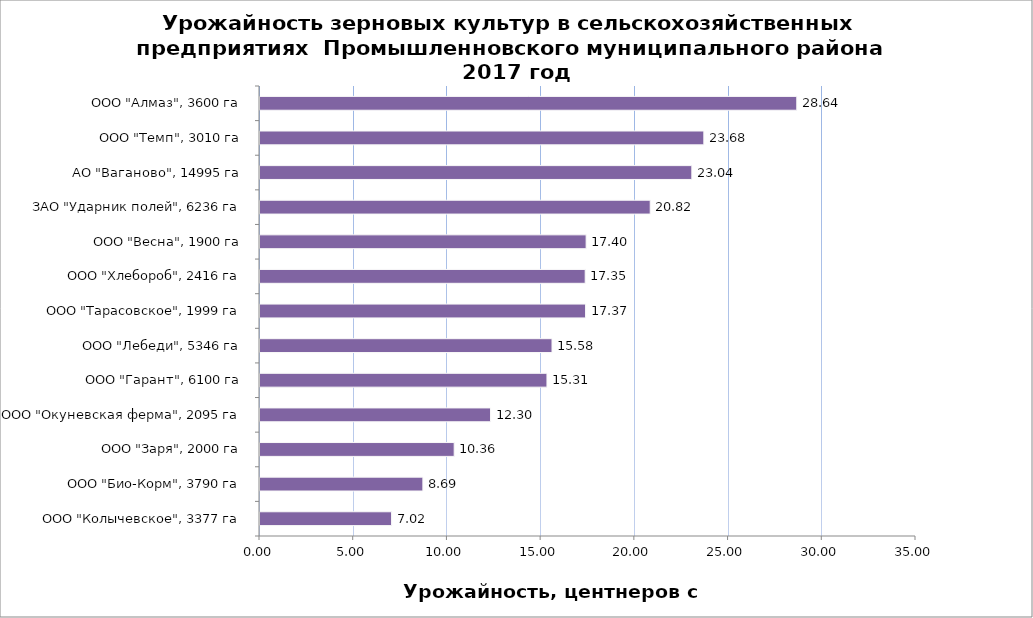
| Category | Series 0 |
|---|---|
| ООО "Колычевское", 3377 га | 7.02 |
| ООО "Био-Корм", 3790 га | 8.69 |
| ООО "Заря", 2000 га | 10.36 |
| ООО "Окуневская ферма", 2095 га | 12.3 |
| ООО "Гарант", 6100 га | 15.31 |
| ООО "Лебеди", 5346 га | 15.58 |
| ООО "Тарасовское", 1999 га | 17.37 |
| ООО "Хлебороб", 2416 га | 17.35 |
| ООО "Весна", 1900 га | 17.4 |
| ЗАО "Ударник полей", 6236 га | 20.82 |
| АО "Ваганово", 14995 га | 23.04 |
| ООО "Темп", 3010 га | 23.68 |
| ООО "Алмаз", 3600 га | 28.64 |